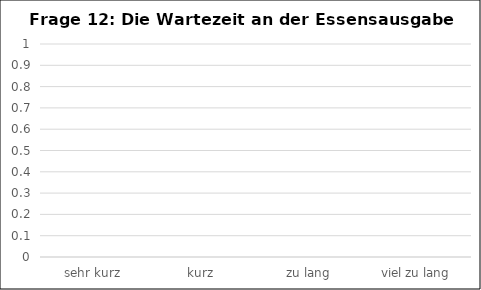
| Category | Series 0 |
|---|---|
| sehr kurz | 0 |
| kurz | 0 |
| zu lang | 0 |
| viel zu lang | 0 |